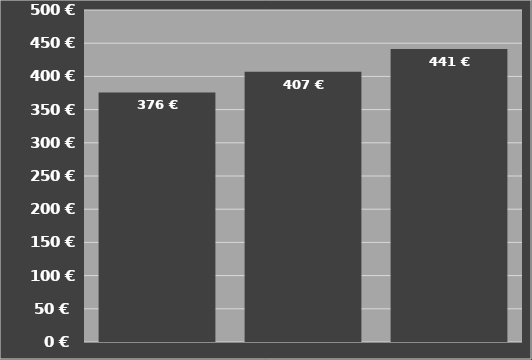
| Category | Kosten je Stunde |
|---|---|
| Case IH 7250
Axial Flow | 375.837 |
| Case IH 8250
Axial Flow | 407.01 |
| Case IH 9250
Axial Flow | 441.398 |